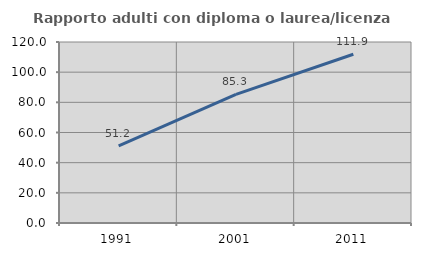
| Category | Rapporto adulti con diploma o laurea/licenza media  |
|---|---|
| 1991.0 | 51.187 |
| 2001.0 | 85.294 |
| 2011.0 | 111.862 |